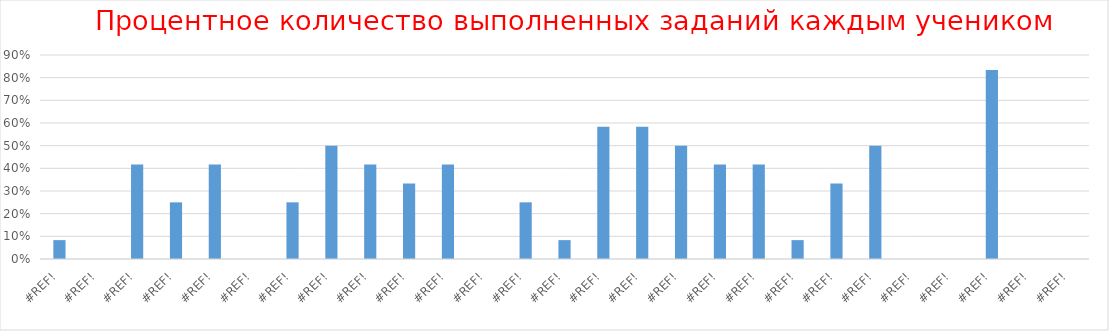
| Category | Series 0 |
|---|---|
| 0.0 | 0.083 |
| 0.0 | 0 |
| 0.0 | 0.417 |
| 0.0 | 0.25 |
| 0.0 | 0.417 |
| 0.0 | 0 |
| 0.0 | 0.25 |
| 0.0 | 0.5 |
| 0.0 | 0.417 |
| 0.0 | 0.333 |
| 0.0 | 0.417 |
| 0.0 | 0 |
| 0.0 | 0.25 |
| 0.0 | 0.083 |
| 0.0 | 0.583 |
| 0.0 | 0.583 |
| 0.0 | 0.5 |
| 0.0 | 0.417 |
| 0.0 | 0.417 |
| 0.0 | 0.083 |
| 0.0 | 0.333 |
| 0.0 | 0.5 |
| 0.0 | 0 |
| 0.0 | 0 |
| 0.0 | 0.833 |
| 0.0 | 0 |
| 0.0 | 0 |